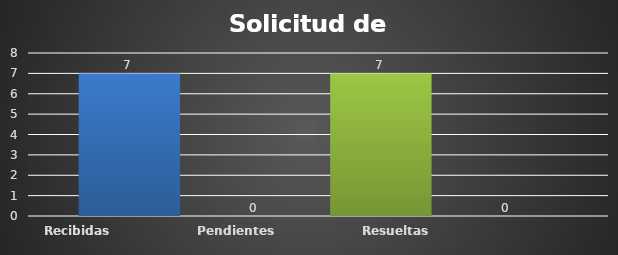
| Category | Recibidas  | Pendientes  | Resueltas | Rechazadas  |
|---|---|---|---|---|
| Recibidas  | 7 | 0 | 7 | 0 |